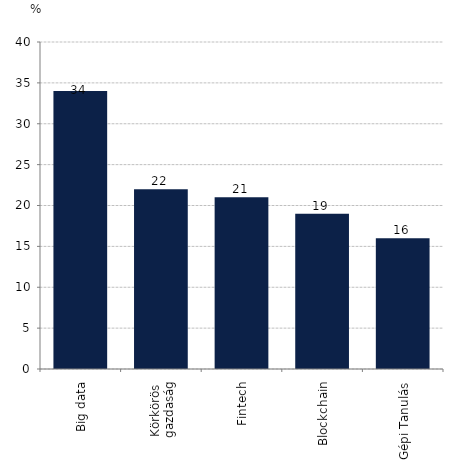
| Category | 10%-os adatfelhasználhatóság növekedés hatása a termelékenységre (árbevétel/fő) |
|---|---|
| Big data | 34 |
| Körkörös
 gazdaság | 22 |
| Fintech | 21 |
| Blockchain | 19 |
| Gépi Tanulás | 16 |